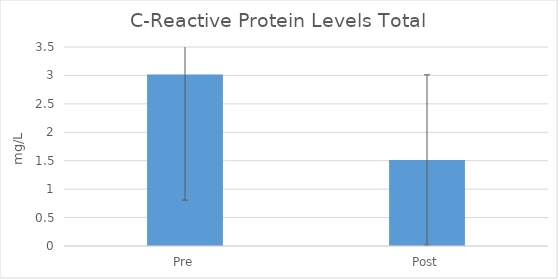
| Category | Series 0 |
|---|---|
| Pre | 3.015 |
| Post | 1.512 |